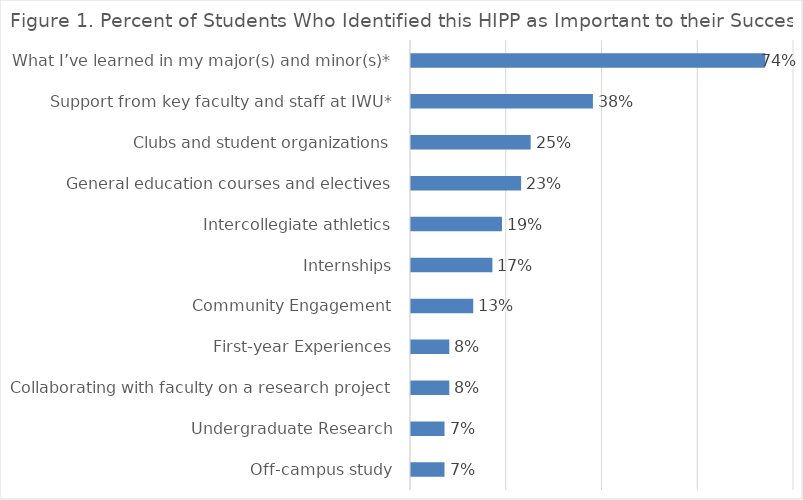
| Category | % Selected |
|---|---|
| Off-campus study | 0.07 |
| Undergraduate Research | 0.07 |
| Collaborating with faculty on a research project | 0.08 |
| First-year Experiences | 0.08 |
| Community Engagement | 0.13 |
| Internships | 0.17 |
| Intercollegiate athletics | 0.19 |
| General education courses and electives | 0.23 |
| Clubs and student organizations | 0.25 |
| Support from key faculty and staff at IWU* | 0.38 |
| What I’ve learned in my major(s) and minor(s)* | 0.74 |